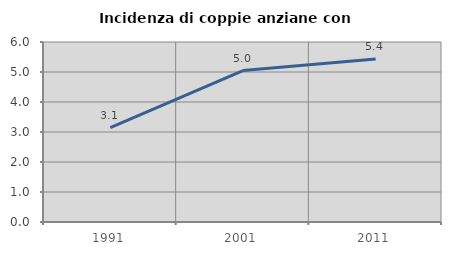
| Category | Incidenza di coppie anziane con figli |
|---|---|
| 1991.0 | 3.148 |
| 2001.0 | 5.046 |
| 2011.0 | 5.435 |